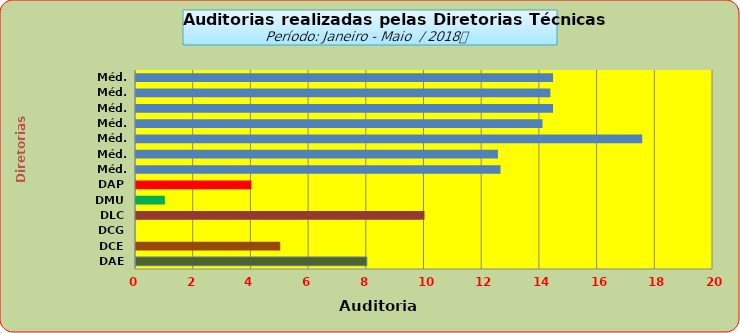
| Category | Series 0 |
|---|---|
| DAE | 8 |
| DCE | 5 |
| DCG | 0 |
| DLC | 10 |
| DMU | 1 |
| DAP | 4 |
| Méd. 2011 | 12.636 |
| Méd. 2012 | 12.545 |
| Méd. 2013 | 17.545 |
| Méd. 2014 | 14.091 |
| Méd. 2015 | 14.455 |
| Méd. 2016 | 14.364 |
| Méd. 2017 | 14.455 |